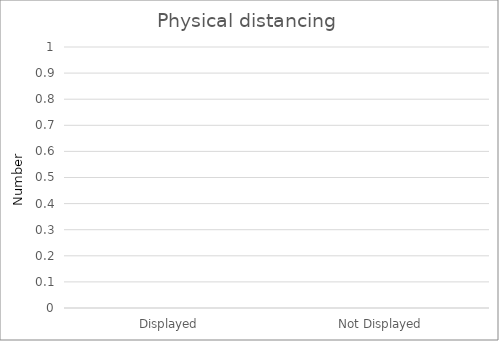
| Category | Physical distancing |
|---|---|
| Displayed | 0 |
| Not Displayed | 0 |